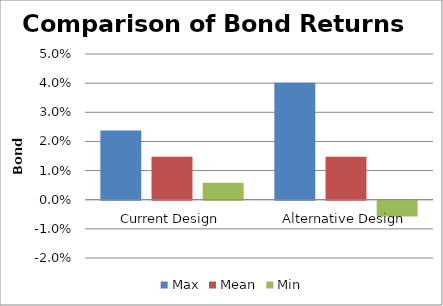
| Category | Max | Mean | Min |
|---|---|---|---|
| Current Design | 0.024 | 0.015 | 0.006 |
| Alternative Design | 0.04 | 0.015 | -0.005 |